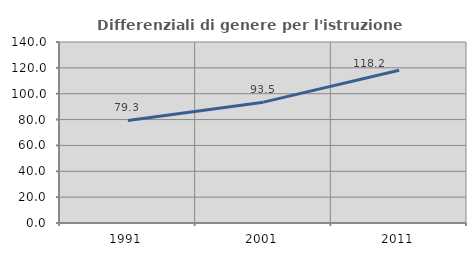
| Category | Differenziali di genere per l'istruzione superiore |
|---|---|
| 1991.0 | 79.299 |
| 2001.0 | 93.465 |
| 2011.0 | 118.182 |